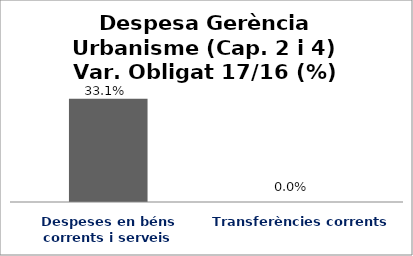
| Category | Series 0 |
|---|---|
| Despeses en béns corrents i serveis | 0.331 |
| Transferències corrents | 0 |